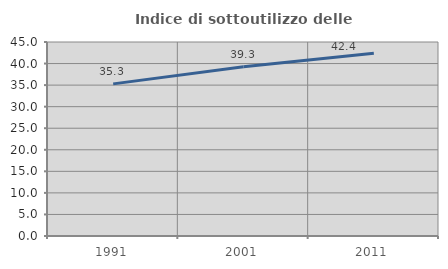
| Category | Indice di sottoutilizzo delle abitazioni  |
|---|---|
| 1991.0 | 35.288 |
| 2001.0 | 39.277 |
| 2011.0 | 42.393 |